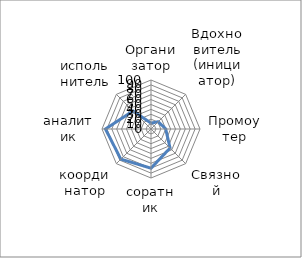
| Category | Series 0 |
|---|---|
| Организатор | 12 |
| Вдохновитель (инициатор) | 21 |
| Промоутер | 30 |
| Связной | 55 |
| соратник | 80 |
| координатор | 87 |
| аналитик | 93 |
| испольнитель | 52 |